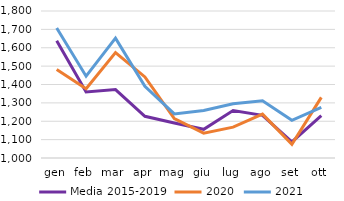
| Category | Media 2015-2019 | 2020 | 2021 |
|---|---|---|---|
| gen | 1638 | 1482 | 1708 |
| feb | 1359.4 | 1377 | 1445 |
| mar | 1372.2 | 1574 | 1652 |
| apr | 1227 | 1441 | 1390 |
| mag | 1190.6 | 1214 | 1240 |
| giu | 1156.2 | 1135 | 1259 |
| lug | 1258 | 1168 | 1295 |
| ago | 1232.2 | 1239 | 1311 |
| set | 1087.2 | 1074 | 1205 |
| ott | 1230 | 1330 | 1275 |